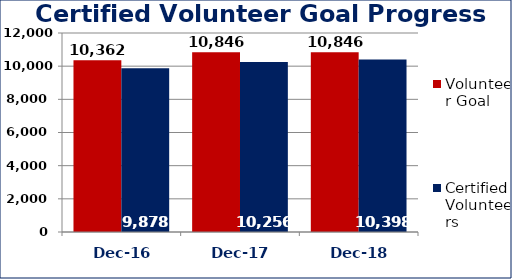
| Category | Volunteer Goal  | Certified Volunteers  |
|---|---|---|
| Dec-16 | 10362 | 9878 |
| Dec-17 | 10846 | 10256 |
| Dec-18 | 10846 | 10398 |